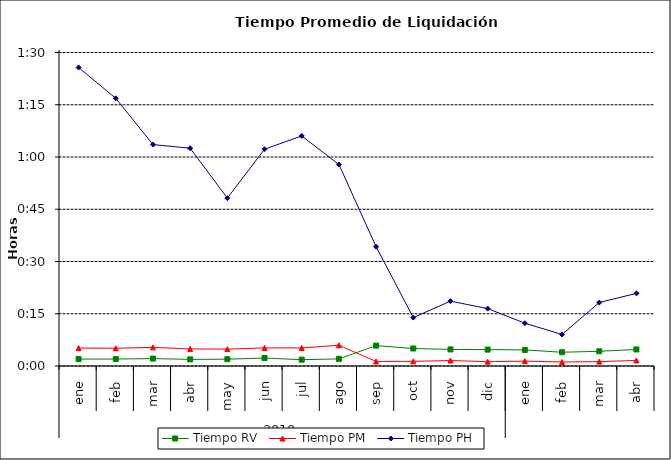
| Category | Tiempo RV | Tiempo PM | Tiempo PH |
|---|---|---|---|
| 0 | 0.001 | 0.004 | 0.06 |
| 1 | 0.001 | 0.004 | 0.053 |
| 2 | 0.001 | 0.004 | 0.044 |
| 3 | 0.001 | 0.003 | 0.043 |
| 4 | 0.001 | 0.003 | 0.033 |
| 5 | 0.002 | 0.004 | 0.043 |
| 6 | 0.001 | 0.004 | 0.046 |
| 7 | 0.001 | 0.004 | 0.04 |
| 8 | 0.004 | 0.001 | 0.024 |
| 9 | 0.003 | 0.001 | 0.01 |
| 10 | 0.003 | 0.001 | 0.013 |
| 11 | 0.003 | 0.001 | 0.011 |
| 12 | 0.003 | 0.001 | 0.009 |
| 13 | 0.003 | 0.001 | 0.006 |
| 14 | 0.003 | 0.001 | 0.013 |
| 15 | 0.003 | 0.001 | 0.014 |